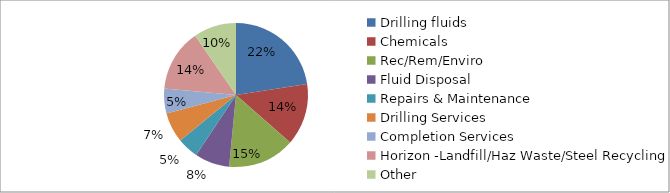
| Category | Series 0 |
|---|---|
| Drilling fluids | 6667724 |
| Chemicals | 4091636 |
| Rec/Rem/Enviro | 4457660 |
| Fluid Disposal | 2302942 |
| Repairs & Maintenance | 1408764 |
| Drilling Services | 1991775 |
| Completion Services | 1643778 |
| Horizon -Landfill/Haz Waste/Steel Recycling | 4132574 |
| Other | 2831452 |